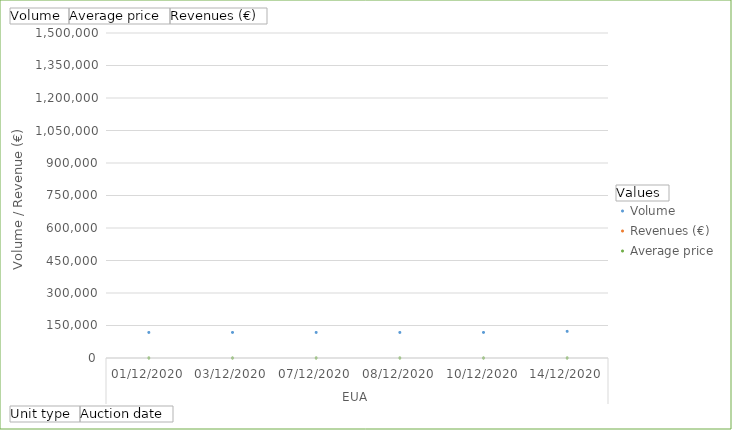
| Category | Volume | Revenues (€) | Average price |
|---|---|---|---|
| 0 | 118000 | 3450320 | 29.24 |
| 1 | 118000 | 3433800 | 29.1 |
| 2 | 118000 | 3479820 | 29.49 |
| 3 | 118000 | 3503420 | 29.69 |
| 4 | 118000 | 3544720 | 30.04 |
| 5 | 123000 | 3803160 | 30.92 |